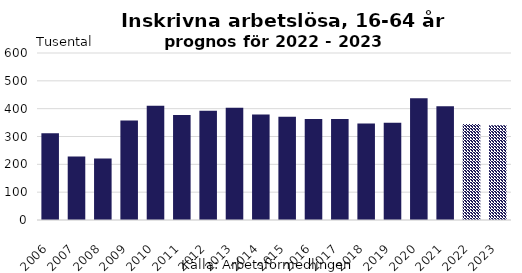
| Category | Inskrivna arbetslösa 16-64 |
|---|---|
| 2006.0 | 311.69 |
| 2007.0 | 228.537 |
| 2008.0 | 221.08 |
| 2009.0 | 357.499 |
| 2010.0 | 410.834 |
| 2011.0 | 377.382 |
| 2012.0 | 392.534 |
| 2013.0 | 403.679 |
| 2014.0 | 379.086 |
| 2015.0 | 370.881 |
| 2016.0 | 363 |
| 2017.0 | 363 |
| 2018.0 | 347 |
| 2019.0 | 349 |
| 2020.0 | 437 |
| 2021.0 | 409 |
| 2022.0 | 345 |
| 2023.0 | 340 |